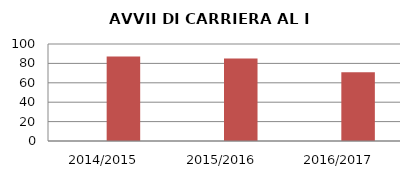
| Category | ANNO | NUMERO |
|---|---|---|
| 2014/2015 | 0 | 87 |
| 2015/2016 | 0 | 85 |
| 2016/2017 | 0 | 71 |